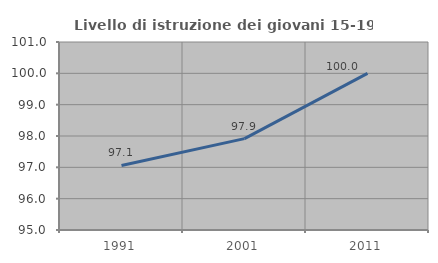
| Category | Livello di istruzione dei giovani 15-19 anni |
|---|---|
| 1991.0 | 97.059 |
| 2001.0 | 97.917 |
| 2011.0 | 100 |